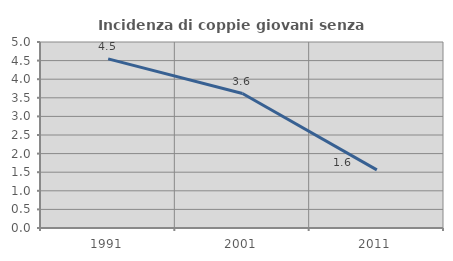
| Category | Incidenza di coppie giovani senza figli |
|---|---|
| 1991.0 | 4.545 |
| 2001.0 | 3.614 |
| 2011.0 | 1.562 |